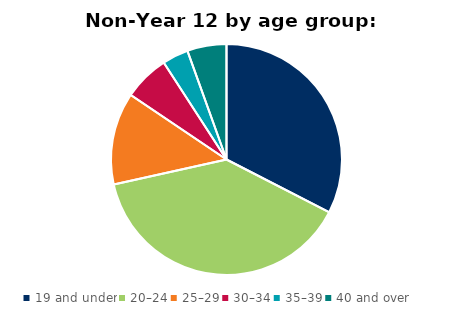
| Category | Series 0 |
|---|---|
| 19 and under | 9620 |
| 20–24 | 11520 |
| 25–29 | 3813 |
| 30–34 | 1896 |
| 35–39 | 1081 |
| 40 and over | 1623 |